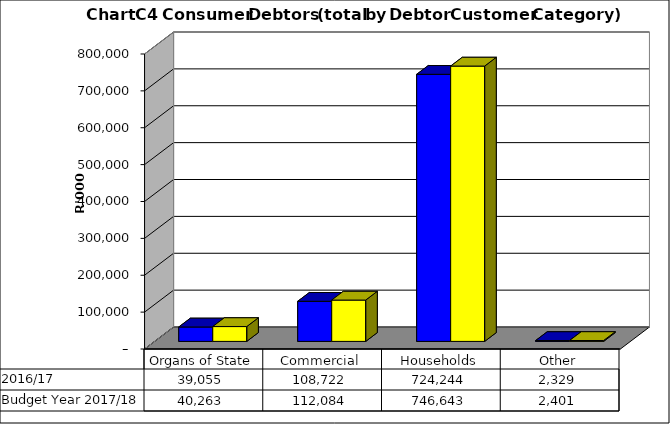
| Category |  2016/17  | Budget Year 2017/18 |
|---|---|---|
| Organs of State | 39055165.969 | 40263057.7 |
| Commercial | 108721694.729 | 112084221.37 |
| Households | 724244033.582 | 746643333.59 |
| Other | 2329325.35 | 2401366.34 |